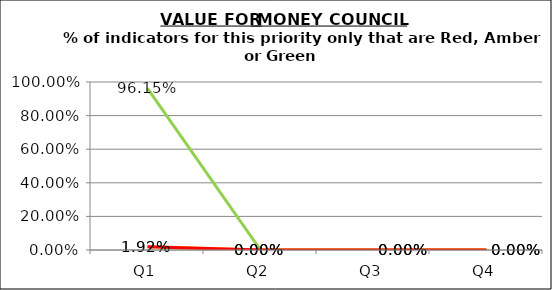
| Category | Green | Amber | Red |
|---|---|---|---|
| Q1 | 0.962 | 0.019 | 0.019 |
| Q2 | 0 | 0 | 0 |
| Q3 | 0 | 0 | 0 |
| Q4 | 0 | 0 | 0 |